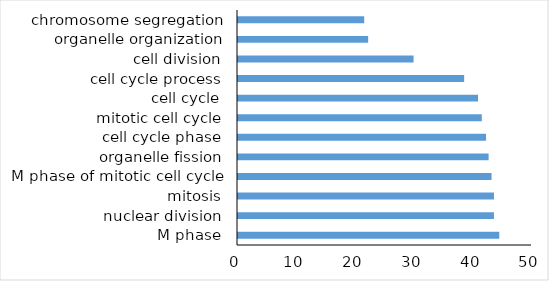
| Category | Series 0 |
|---|---|
| M phase | 44.434 |
| nuclear division | 43.535 |
| mitosis | 43.535 |
| M phase of mitotic cell cycle | 43.123 |
| organelle fission | 42.62 |
| cell cycle phase | 42.184 |
| mitotic cell cycle | 41.463 |
| cell cycle | 40.826 |
| cell cycle process | 38.463 |
| cell division | 29.858 |
| organelle organization | 22.134 |
| chromosome segregation | 21.467 |